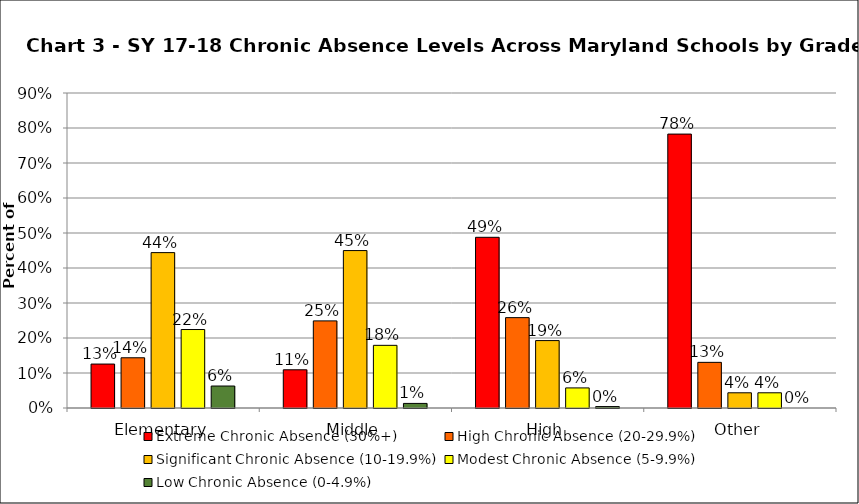
| Category | Extreme Chronic Absence (30%+) | High Chronic Absence (20-29.9%) | Significant Chronic Absence (10-19.9%) | Modest Chronic Absence (5-9.9%) | Low Chronic Absence (0-4.9%) |
|---|---|---|---|---|---|
| 0 | 0.126 | 0.143 | 0.444 | 0.224 | 0.063 |
| 1 | 0.109 | 0.249 | 0.45 | 0.179 | 0.013 |
| 2 | 0.488 | 0.258 | 0.193 | 0.057 | 0.004 |
| 3 | 0.783 | 0.13 | 0.043 | 0.043 | 0 |